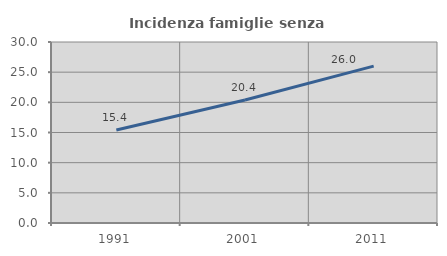
| Category | Incidenza famiglie senza nuclei |
|---|---|
| 1991.0 | 15.423 |
| 2001.0 | 20.374 |
| 2011.0 | 26.001 |